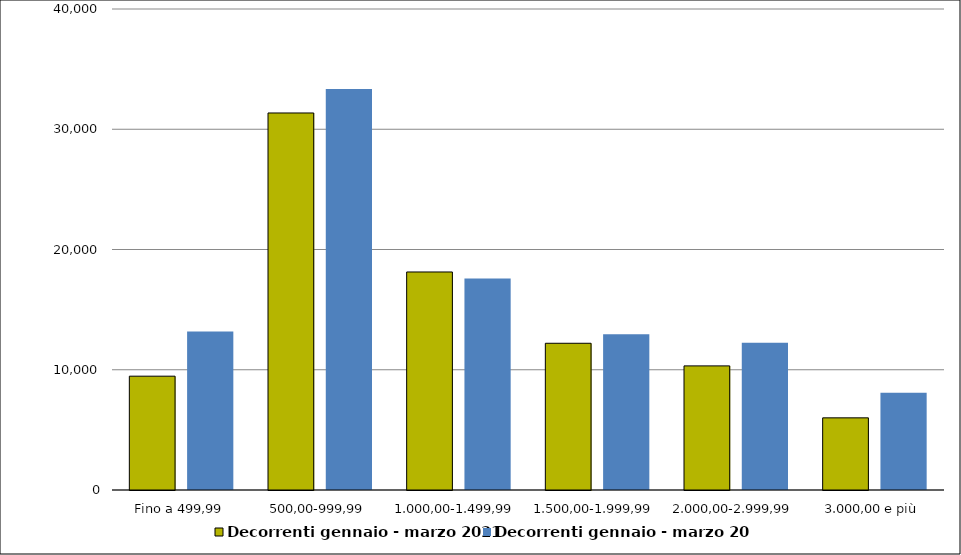
| Category | Decorrenti gennaio - marzo 2021 | Decorrenti gennaio - marzo 2020 |
|---|---|---|
|  Fino a 499,99  | 9465 | 13172 |
|  500,00-999,99  | 31353 | 33352 |
|  1.000,00-1.499,99  | 18131 | 17584 |
|  1.500,00-1.999,99  | 12202 | 12942 |
|  2.000,00-2.999,99  | 10321 | 12247 |
|  3.000,00 e più  | 6000 | 8097 |